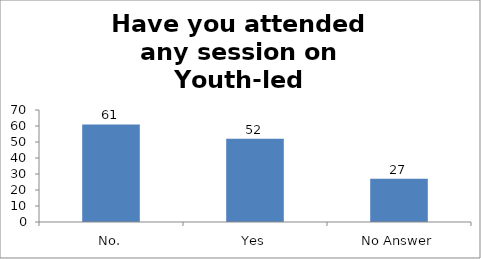
| Category | Have you attended any session on Youth-led Changemaking before? |
|---|---|
| No. | 61 |
| Yes | 52 |
| No Answer | 27 |